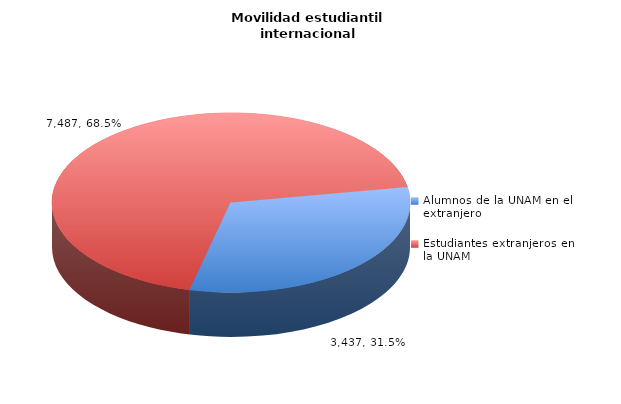
| Category | Series 0 |
|---|---|
| Alumnos de la UNAM en el extranjero | 3437 |
| Estudiantes extranjeros en la UNAM | 7487 |